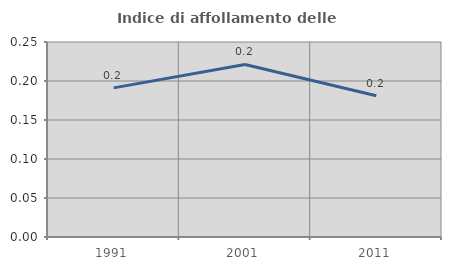
| Category | Indice di affollamento delle abitazioni  |
|---|---|
| 1991.0 | 0.191 |
| 2001.0 | 0.221 |
| 2011.0 | 0.181 |